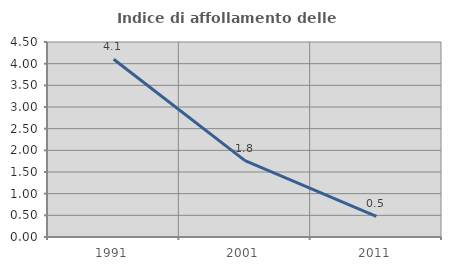
| Category | Indice di affollamento delle abitazioni  |
|---|---|
| 1991.0 | 4.103 |
| 2001.0 | 1.763 |
| 2011.0 | 0.475 |